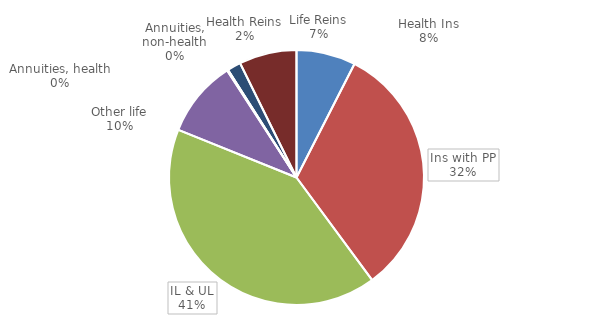
| Category | Series 0 |
|---|---|
| Health Ins | 65428.08 |
| Ins with PP | 282122.89 |
| IL & UL | 359082.86 |
| Other life | 84873.64 |
| Annuities, health | 1053.31 |
| Annuities, non-health | 93.43 |
| Health Reins | 15027.84 |
| Life Reins | 63606.57 |